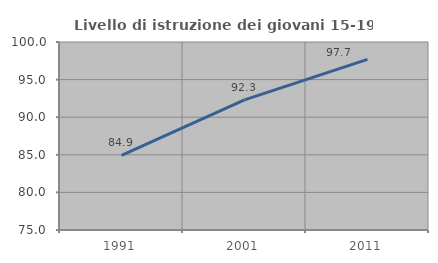
| Category | Livello di istruzione dei giovani 15-19 anni |
|---|---|
| 1991.0 | 84.928 |
| 2001.0 | 92.308 |
| 2011.0 | 97.696 |